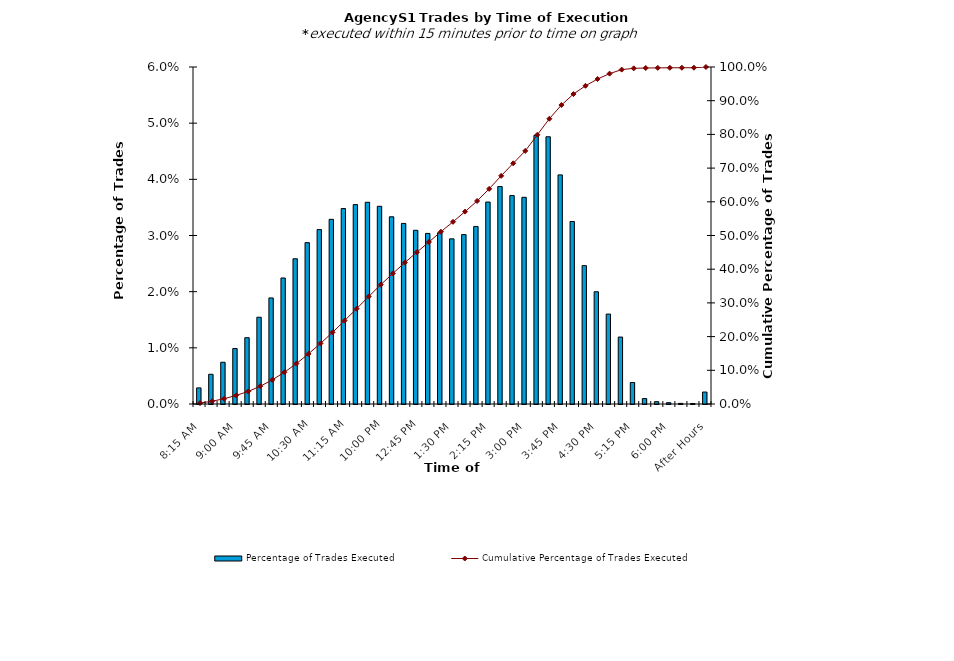
| Category | Percentage of Trades Executed |
|---|---|
| 8:15 AM | 0.003 |
| 8:30 AM | 0.005 |
| 8:45 AM | 0.007 |
| 9:00 AM | 0.01 |
| 9:15 AM | 0.012 |
| 9:30 AM | 0.015 |
| 9:45 AM | 0.019 |
| 10:00 AM | 0.022 |
| 10:15 AM | 0.026 |
| 10:30 AM | 0.029 |
| 10:45 AM | 0.031 |
| 11:00 AM | 0.033 |
| 11:15 AM | 0.035 |
| 11:30 AM | 0.035 |
| 11:45 AM | 0.036 |
| 12:00 PM | 0.035 |
| 12:15 PM | 0.033 |
| 12:30 PM | 0.032 |
| 12:45 PM | 0.031 |
| 1:00 PM | 0.03 |
| 1:15 PM | 0.03 |
| 1:30 PM | 0.029 |
| 1:45 PM | 0.03 |
| 2:00 PM | 0.032 |
| 2:15 PM | 0.036 |
| 2:30 PM | 0.039 |
| 2:45 PM | 0.037 |
| 3:00 PM | 0.037 |
| 3:15 PM | 0.048 |
| 3:30 PM | 0.048 |
| 3:45 PM | 0.041 |
| 4:00 PM | 0.032 |
| 4:15 PM | 0.025 |
| 4:30 PM | 0.02 |
| 4:45 PM | 0.016 |
| 5:00 PM | 0.012 |
| 5:15 PM | 0.004 |
| 5:30 PM | 0.001 |
| 5:45 PM | 0 |
| 6:00 PM | 0 |
| 6:15 PM | 0 |
| 6:30 PM | 0 |
| After Hours | 0.002 |